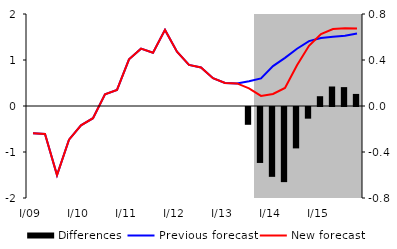
| Category | Differences |
|---|---|
| 0 | 0 |
| 1 | 0 |
| 2 | 0 |
| 3 | 0 |
| 4 | 0 |
| 5 | 0 |
| 6 | 0 |
| 7 | 0 |
| 8 | 0 |
| 9 | 0 |
| 10 | 0 |
| 11 | 0 |
| 12 | 0 |
| 13 | 0 |
| 14 | 0 |
| 15 | 0 |
| 16 | 0 |
| 17 | 0 |
| 18 | -0.155 |
| 19 | -0.487 |
| 20 | -0.607 |
| 21 | -0.653 |
| 22 | -0.36 |
| 23 | -0.101 |
| 24 | 0.085 |
| 25 | 0.17 |
| 26 | 0.164 |
| 27 | 0.105 |